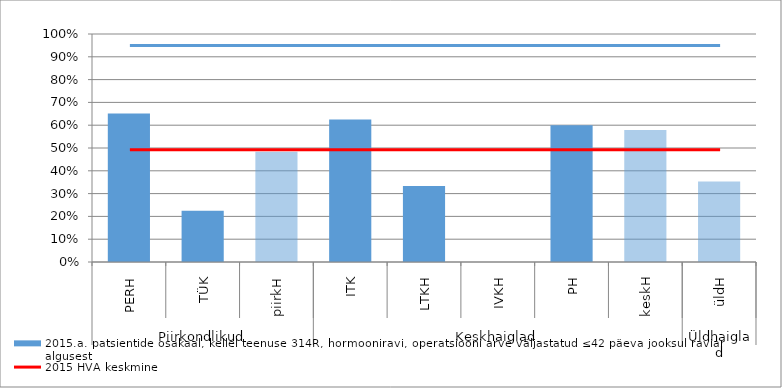
| Category | 2015.a. patsientide osakaal, kellel teenuse 314R, hormooniravi, operatsiooni arve väljastatud ≤42 päeva jooksul raviarve algusest |
|---|---|
| 0 | 0.651 |
| 1 | 0.225 |
| 2 | 0.484 |
| 3 | 0.625 |
| 4 | 0.333 |
| 5 | 0 |
| 6 | 0.6 |
| 7 | 0.579 |
| 8 | 0.353 |